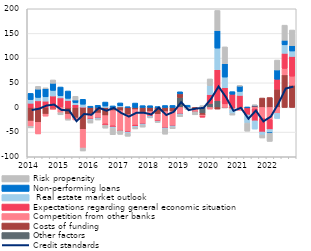
| Category | Other factors | Costs of funding | Competition from other banks | Expectations regarding general economic situation |  Real estate market outlook | Non-performing loans  | Risk propensity |
|---|---|---|---|---|---|---|---|
| 2014.0 | 0.064 | -27.614 | -10.883 | 8.513 | 7.366 | 12.572 | -2.931 |
| nan | 0 | -30.154 | -23.565 | 13.381 | 6.958 | 16.79 | 5.591 |
| nan | 0 | -13.58 | -4.04 | 12.84 | 8.698 | 16.68 | 1.322 |
| nan | 0 | -3.194 | -0.943 | 23.215 | 11.346 | 14.413 | 6.815 |
| 2015.0 | 0 | 1.584 | -10.634 | 17.798 | 4.391 | 17.665 | -4.309 |
| nan | 0 | -13.709 | -9.748 | 14.011 | 4.433 | 14.906 | -2.291 |
| nan | 0 | -21.32 | -4.036 | 5.521 | 4.364 | 5.262 | 7.435 |
| nan | 0 | -44.371 | -37.787 | 0.672 | 5.886 | 9.984 | -6.068 |
| 2016.0 | 0 | -13.683 | -9.865 | -0.183 | -2.017 | 2.537 | -5.896 |
| nan | 0 | -11.339 | -9.602 | -0.197 | -1.974 | 4.34 | -2.332 |
| nan | 0 | -16.54 | -16.708 | -2.652 | 2.885 | 8.061 | -6.073 |
| nan | 0 | -6.439 | -30.804 | -2.596 | -1.957 | 3.101 | -13.396 |
| 2017.0 | 1.137 | -6.563 | -40.484 | -0.096 | 2.394 | 5.669 | -7.434 |
| nan | 0 | -14.708 | -34.121 | -1.211 | -2.234 | 1.309 | -6.144 |
| nan | 0 | -4.365 | -31.359 | -2.483 | -2.033 | 8.902 | -3.307 |
| nan | 0 | -9.63 | -23.589 | -0.294 | -2.083 | 3.686 | -4.267 |
| 2018.0 | 0 | -8.401 | -9.465 | -0.308 | -2.087 | 3.545 | -0.758 |
| nan | 0 | -13.817 | -13.719 | -0.384 | -1.143 | 1.627 | -1.188 |
| nan | 0 | -8.391 | -32.723 | -0.405 | -2.001 | 3.96 | -10.656 |
| nan | 0 | -8.386 | -28.581 | -0.415 | -2.043 | 4.097 | -3.682 |
| 2019.0 | 19.953 | 7.614 | -12.529 | -0.41 | -2.062 | 4.174 | -3.764 |
| nan | 0 | -0.003 | 0 | -0.494 | 0 | 4.55 | -3.594 |
| nan | 0 | -3.529 | -4.583 | -0.546 | 0 | 0 | -6.275 |
| nan | -12.056 | -3.387 | -3.387 | -0.556 | 0 | 0 | 3.746 |
| 2020.0 | 8.238 | 0 | -3.33 | 17.776 | 18.324 | 0 | 13.516 |
| nan | 13.485 | -3.256 | 0 | 63.053 | 43.711 | 35.524 | 40.823 |
| nan | -0.727 | 0 | 7.248 | 32.599 | 21.695 | 27.071 | 34.236 |
| nan | -0.411 | -0.778 | -3.063 | 26.746 | -8.12 | 5.298 | -3.047 |
| 2021.0 | -0.834 | 0 | -5.032 | 24.468 | 7.975 | 11.008 | 0.658 |
| nan | 0 | 0 | 0 | -15.124 | -16.532 | 0.072 | -16.532 |
| nan | 0 | 2.953 | -2.953 | -24.203 | -16.663 | 1.353 | 0.892 |
| nan | 0 | 19.115 | -21.697 | -28.046 | -6.07 | 0 | -6.07 |
| 2022.0 | 0 | 20.125 | -24.614 | -20.125 | -5.951 | -1.279 | -16.835 |
| nan | 0 | 37.013 | -11.836 | 20.124 | -10.556 | 18.845 | 20.124 |
| nan | 0 | 66.094 | 12.965 | 30.671 | 17.174 | 9.238 | 30.671 |
| nan | 0 | 45.139 | 18.202 | 40.075 | 10.973 | 10.973 | 31.645 |